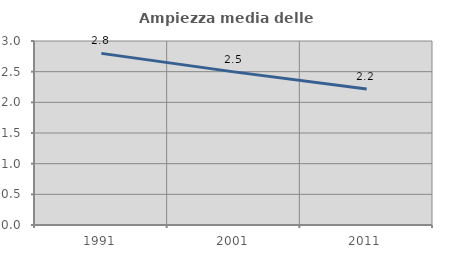
| Category | Ampiezza media delle famiglie |
|---|---|
| 1991.0 | 2.798 |
| 2001.0 | 2.497 |
| 2011.0 | 2.218 |